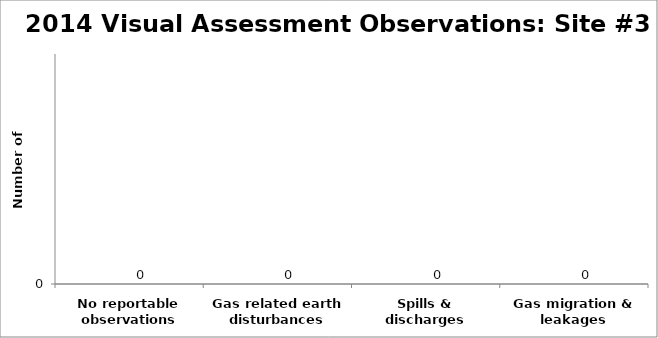
| Category | Series 0 | Series 1 | Series 2 | Series 3 |
|---|---|---|---|---|
| No reportable observations |  |  | 0 |  |
| Gas related earth disturbances |  |  | 0 |  |
| Spills & discharges |  |  | 0 |  |
| Gas migration & leakages |  |  | 0 |  |